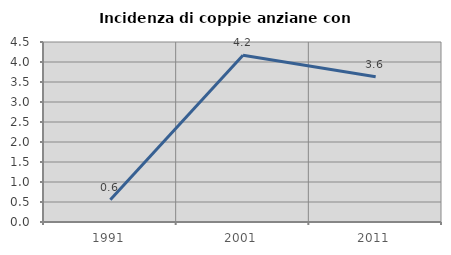
| Category | Incidenza di coppie anziane con figli |
|---|---|
| 1991.0 | 0.556 |
| 2001.0 | 4.167 |
| 2011.0 | 3.629 |